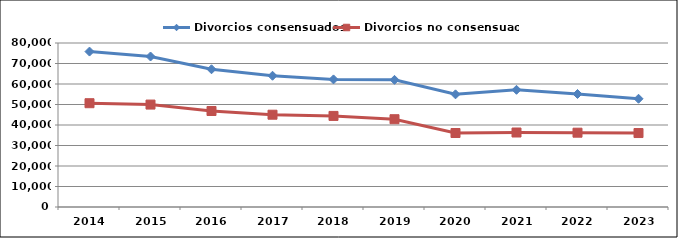
| Category | Divorcios consensuados | Divorcios no consensuados |
|---|---|---|
| 2014.0 | 75820 | 50626 |
| 2015.0 | 73414 | 49963 |
| 2016.0 | 67189 | 46830 |
| 2017.0 | 64024 | 45019 |
| 2018.0 | 62241 | 44433 |
| 2019.0 | 62020 | 42826 |
| 2020.0 | 54960 | 36090 |
| 2021.0 | 57168 | 36337 |
| 2022.0 | 55123 | 36250 |
| 2023.0 | 52803 | 36082 |